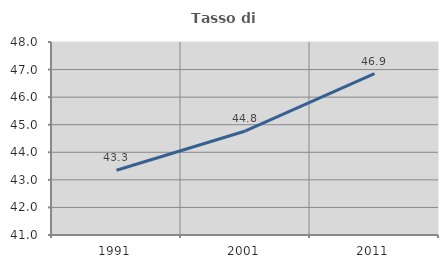
| Category | Tasso di occupazione   |
|---|---|
| 1991.0 | 43.348 |
| 2001.0 | 44.772 |
| 2011.0 | 46.856 |